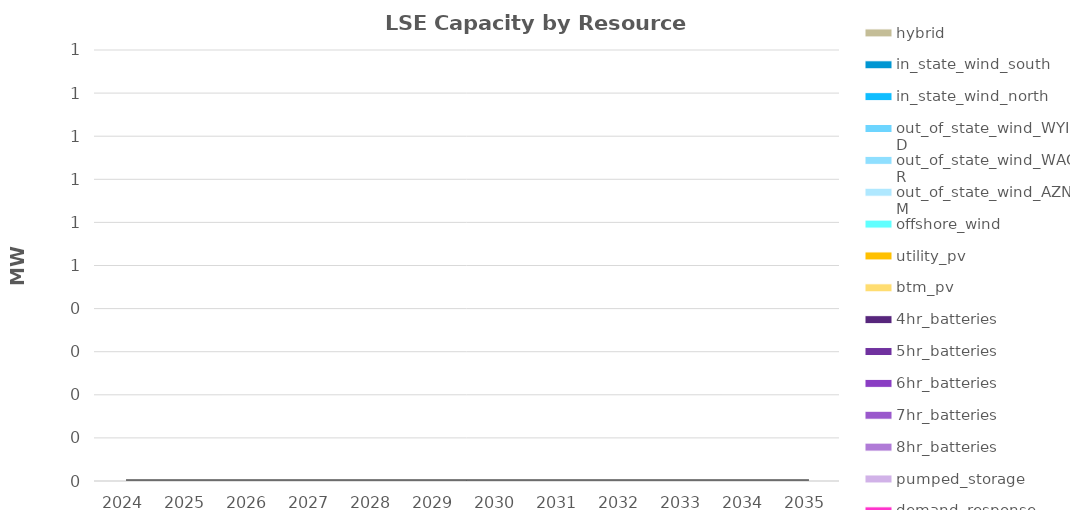
| Category | unspecified_import | steam | coal | ice | cogen | gas_ct | gas_cc | nuclear | biogas | biomass_wood | geothermal | small_hydro | hydro | demand_response | pumped_storage | 8hr_batteries | 7hr_batteries | 6hr_batteries | 5hr_batteries | 4hr_batteries | btm_pv | utility_pv | offshore_wind | out_of_state_wind_AZNM | out_of_state_wind_WAOR | out_of_state_wind_WYID | in_state_wind_north | in_state_wind_south | hybrid |
|---|---|---|---|---|---|---|---|---|---|---|---|---|---|---|---|---|---|---|---|---|---|---|---|---|---|---|---|---|---|
| 2024.0 | 0 | 0 | 0 | 0 | 0 | 0 | 0 | 0 | 0 | 0 | 0 | 0 | 0 | 0 | 0 | 0 | 0 | 0 | 0 | 0 | 0 | 0 | 0 | 0 | 0 | 0 | 0 | 0 | 0 |
| 2025.0 | 0 | 0 | 0 | 0 | 0 | 0 | 0 | 0 | 0 | 0 | 0 | 0 | 0 | 0 | 0 | 0 | 0 | 0 | 0 | 0 | 0 | 0 | 0 | 0 | 0 | 0 | 0 | 0 | 0 |
| 2026.0 | 0 | 0 | 0 | 0 | 0 | 0 | 0 | 0 | 0 | 0 | 0 | 0 | 0 | 0 | 0 | 0 | 0 | 0 | 0 | 0 | 0 | 0 | 0 | 0 | 0 | 0 | 0 | 0 | 0 |
| 2027.0 | 0 | 0 | 0 | 0 | 0 | 0 | 0 | 0 | 0 | 0 | 0 | 0 | 0 | 0 | 0 | 0 | 0 | 0 | 0 | 0 | 0 | 0 | 0 | 0 | 0 | 0 | 0 | 0 | 0 |
| 2028.0 | 0 | 0 | 0 | 0 | 0 | 0 | 0 | 0 | 0 | 0 | 0 | 0 | 0 | 0 | 0 | 0 | 0 | 0 | 0 | 0 | 0 | 0 | 0 | 0 | 0 | 0 | 0 | 0 | 0 |
| 2029.0 | 0 | 0 | 0 | 0 | 0 | 0 | 0 | 0 | 0 | 0 | 0 | 0 | 0 | 0 | 0 | 0 | 0 | 0 | 0 | 0 | 0 | 0 | 0 | 0 | 0 | 0 | 0 | 0 | 0 |
| 2030.0 | 0 | 0 | 0 | 0 | 0 | 0 | 0 | 0 | 0 | 0 | 0 | 0 | 0 | 0 | 0 | 0 | 0 | 0 | 0 | 0 | 0 | 0 | 0 | 0 | 0 | 0 | 0 | 0 | 0 |
| 2031.0 | 0 | 0 | 0 | 0 | 0 | 0 | 0 | 0 | 0 | 0 | 0 | 0 | 0 | 0 | 0 | 0 | 0 | 0 | 0 | 0 | 0 | 0 | 0 | 0 | 0 | 0 | 0 | 0 | 0 |
| 2032.0 | 0 | 0 | 0 | 0 | 0 | 0 | 0 | 0 | 0 | 0 | 0 | 0 | 0 | 0 | 0 | 0 | 0 | 0 | 0 | 0 | 0 | 0 | 0 | 0 | 0 | 0 | 0 | 0 | 0 |
| 2033.0 | 0 | 0 | 0 | 0 | 0 | 0 | 0 | 0 | 0 | 0 | 0 | 0 | 0 | 0 | 0 | 0 | 0 | 0 | 0 | 0 | 0 | 0 | 0 | 0 | 0 | 0 | 0 | 0 | 0 |
| 2034.0 | 0 | 0 | 0 | 0 | 0 | 0 | 0 | 0 | 0 | 0 | 0 | 0 | 0 | 0 | 0 | 0 | 0 | 0 | 0 | 0 | 0 | 0 | 0 | 0 | 0 | 0 | 0 | 0 | 0 |
| 2035.0 | 0 | 0 | 0 | 0 | 0 | 0 | 0 | 0 | 0 | 0 | 0 | 0 | 0 | 0 | 0 | 0 | 0 | 0 | 0 | 0 | 0 | 0 | 0 | 0 | 0 | 0 | 0 | 0 | 0 |